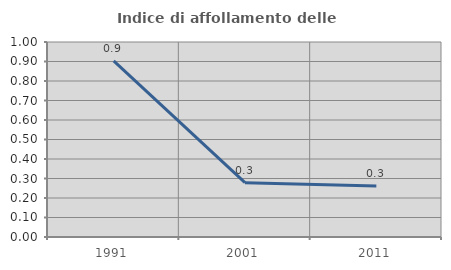
| Category | Indice di affollamento delle abitazioni  |
|---|---|
| 1991.0 | 0.904 |
| 2001.0 | 0.279 |
| 2011.0 | 0.261 |